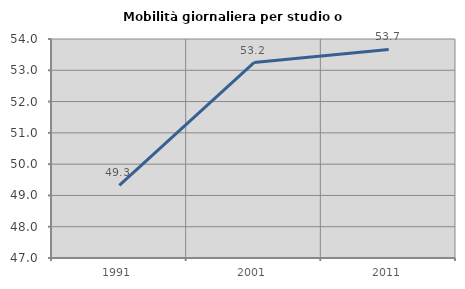
| Category | Mobilità giornaliera per studio o lavoro |
|---|---|
| 1991.0 | 49.323 |
| 2001.0 | 53.246 |
| 2011.0 | 53.667 |